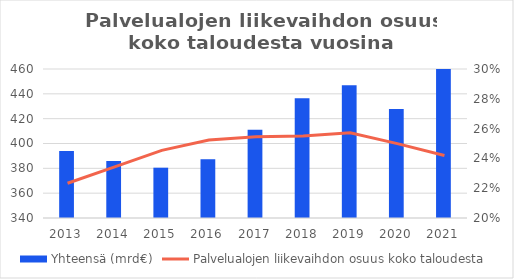
| Category | Yhteensä (mrd€) |
|---|---|
| 2013.0 | 393.86 |
| 2014.0 | 385.897 |
| 2015.0 | 380.516 |
| 2016.0 | 387.328 |
| 2017.0 | 411.147 |
| 2018.0 | 436.536 |
| 2019.0 | 446.836 |
| 2020.0 | 427.868 |
| 2021.0 | 488.748 |